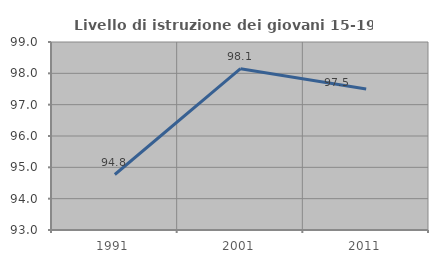
| Category | Livello di istruzione dei giovani 15-19 anni |
|---|---|
| 1991.0 | 94.771 |
| 2001.0 | 98.148 |
| 2011.0 | 97.5 |